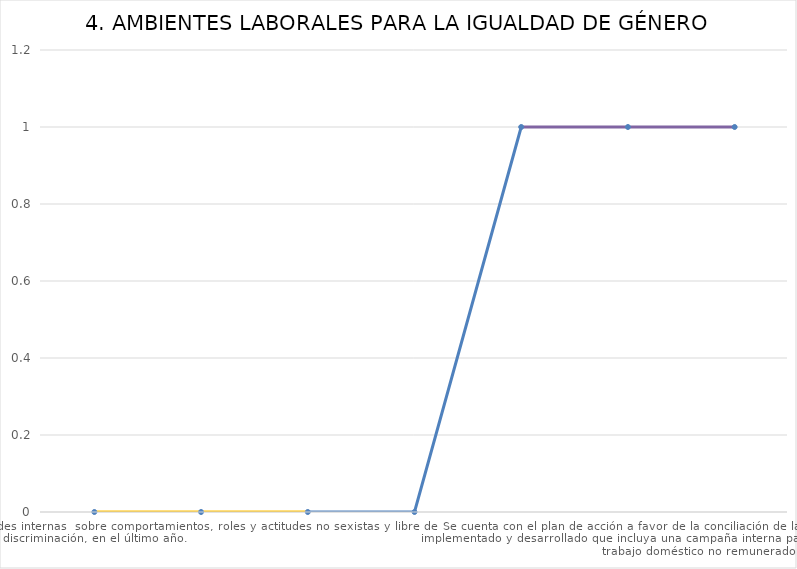
| Category | Series 0 |
|---|---|
| Se cuenta con al menos dos actividades internas  sobre comportamientos, roles y actitudes no sexistas y libre de discriminación, en el último año.  _x000d__x000d_ | 0 |
| Campañas de sensibilización de tolerancia cero con el acoso sexual y  laboral y la prevención de la violencia contra las mujeres y de género.  | 0 |
| Politica de tolerancia cero  y protocolo  para prevenir, atender  y sancionar la discriminación, el acoso sexual y laboral en el lugar de trabajo y la violencia contra las mujeres y de género. | 0 |
| Se cuenta con un diagnóstico de los procesos de reclutamiento y selección, desarrollo profesional y de carrera y políticas salariales desde una perspectiva de género y no discriminación. | 0 |
| Se cuenta con un plan de acción implementado, todos sus procesos de selección incluyen una perspectiva de género, se conoce la brecha salarial y promueve a más mujeres dentro de su estructura.  | 1 |
| Se cuenta con comunicaciones internas que divulgan las políticas vigentes sobre conciliación de la vida familiar y laboral con corresponsabilidad  (licencias, horarios flexibles y servicios) y se ha realizado una encuesta de necesidades de cuidados del pe | 1 |
| Se cuenta con el plan de acción a favor de la conciliación de la vida familiar y laboral con corresponsabilidad implementado y desarrollado que incluya una campaña interna para favorecer la incorporación de los hombres en el trabajo doméstico no remunerad | 1 |